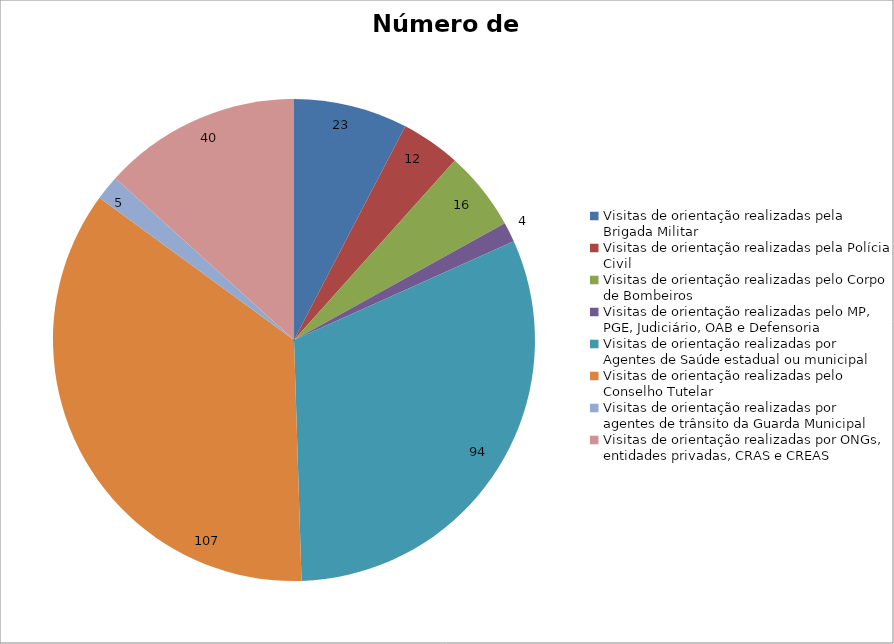
| Category | Número de Ações |
|---|---|
| Visitas de orientação realizadas pela Brigada Militar | 23 |
| Visitas de orientação realizadas pela Polícia Civil | 12 |
| Visitas de orientação realizadas pelo Corpo de Bombeiros | 16 |
| Visitas de orientação realizadas pelo MP, PGE, Judiciário, OAB e Defensoria | 4 |
| Visitas de orientação realizadas por Agentes de Saúde estadual ou municipal | 94 |
| Visitas de orientação realizadas pelo Conselho Tutelar | 107 |
| Visitas de orientação realizadas por agentes de trânsito da Guarda Municipal | 5 |
| Visitas de orientação realizadas por ONGs, entidades privadas, CRAS e CREAS | 40 |